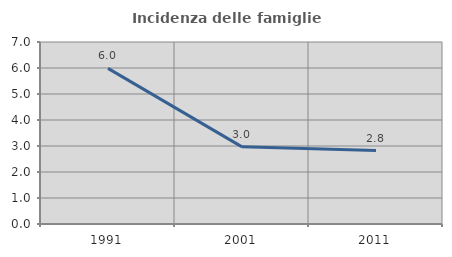
| Category | Incidenza delle famiglie numerose |
|---|---|
| 1991.0 | 5.985 |
| 2001.0 | 2.967 |
| 2011.0 | 2.827 |